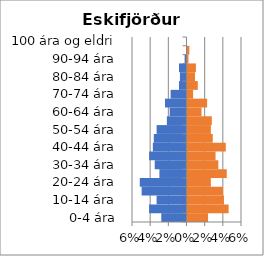
| Category | % karlar | %konur |
|---|---|---|
| 0-4 ára | -0.028 | 0.023 |
| 5-9 ára | -0.041 | 0.045 |
| 10-14 ára | -0.033 | 0.04 |
| 15-19 ára | -0.049 | 0.039 |
| 20-24 ára | -0.051 | 0.026 |
| 25-29 ára | -0.03 | 0.043 |
| 30-34 ára | -0.035 | 0.034 |
| 35-39 ára | -0.041 | 0.031 |
| 40-44 ára | -0.037 | 0.042 |
| 45-49 ára | -0.036 | 0.028 |
| 50-54 ára | -0.033 | 0.026 |
| 55-59 ára | -0.022 | 0.027 |
| 60-64 ára | -0.019 | 0.015 |
| 65-69 ára | -0.024 | 0.022 |
| 70-74 ára | -0.017 | 0.006 |
| 75-79 ára | -0.008 | 0.011 |
| 80-84 ára | -0.007 | 0.008 |
| 85-89 ára | -0.008 | 0.009 |
| 90-94 ára | -0.002 | 0.001 |
| 95-99 ára | 0 | 0.002 |
| 100 ára og eldri | 0 | 0 |